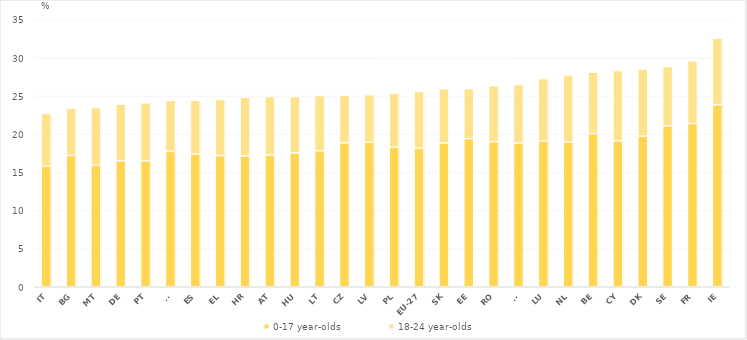
| Category | 0-17 year-olds | 18-24 year-olds |
|---|---|---|
| IT | 15.786 | 6.921 |
| BG | 17.213 | 6.204 |
| MT | 15.914 | 7.581 |
| DE | 16.528 | 7.409 |
| PT | 16.524 | 7.586 |
| SI | 17.744 | 6.692 |
| ES | 17.389 | 7.064 |
| EL | 17.202 | 7.352 |
| HR | 17.14 | 7.727 |
| AT | 17.284 | 7.653 |
| HU | 17.539 | 7.408 |
| LT | 17.825 | 7.257 |
| CZ | 18.862 | 6.256 |
| LV | 18.938 | 6.238 |
| PL | 18.294 | 7.058 |
| EU-27 | 18.153 | 7.468 |
| SK | 18.832 | 7.116 |
| EE | 19.415 | 6.546 |
| RO | 19.016 | 7.332 |
| FI | 18.821 | 7.698 |
| LU | 19.062 | 8.222 |
| NL | 18.948 | 8.811 |
| BE | 20.089 | 8.036 |
| CY | 19.138 | 9.202 |
| DK | 19.743 | 8.787 |
| SE | 21.094 | 7.75 |
| FR | 21.398 | 8.228 |
| IE | 23.866 | 8.73 |